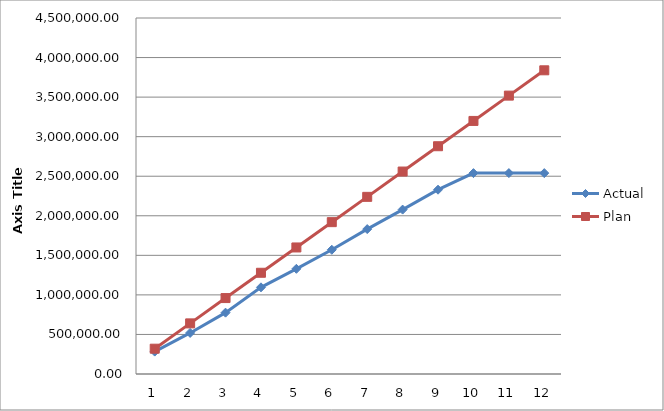
| Category | Actual | Plan |
|---|---|---|
| 0 | 283037.95 | 319897.833 |
| 1 | 519075.9 | 639795.667 |
| 2 | 775352.89 | 959693.5 |
| 3 | 1095566.09 | 1279591.333 |
| 4 | 1329454.29 | 1599489.167 |
| 5 | 1570331.73 | 1919387 |
| 6 | 1831669.24 | 2239284.833 |
| 7 | 2078092.85 | 2559182.667 |
| 8 | 2329638.75 | 2879080.5 |
| 9 | 2539217.26 | 3198978.333 |
| 10 | 2539217.26 | 3518876.167 |
| 11 | 2539217.26 | 3838774 |